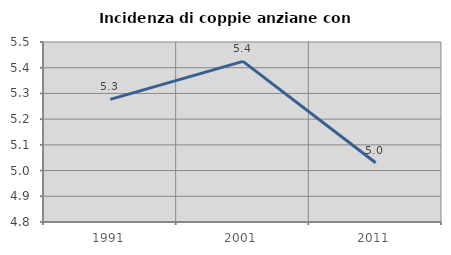
| Category | Incidenza di coppie anziane con figli |
|---|---|
| 1991.0 | 5.277 |
| 2001.0 | 5.425 |
| 2011.0 | 5.03 |